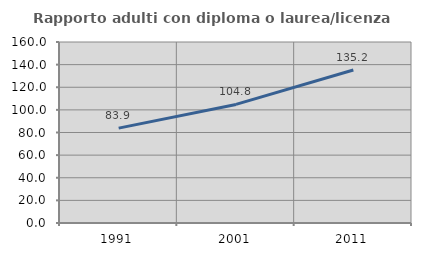
| Category | Rapporto adulti con diploma o laurea/licenza media  |
|---|---|
| 1991.0 | 83.865 |
| 2001.0 | 104.832 |
| 2011.0 | 135.227 |